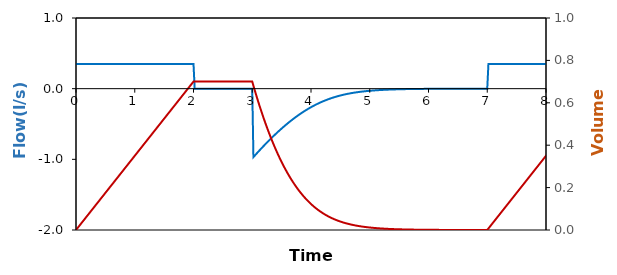
| Category | V' |
|---|---|
| 0.0 | 0.35 |
| 0.02 | 0.35 |
| 0.04 | 0.35 |
| 0.06 | 0.35 |
| 0.08 | 0.35 |
| 0.1 | 0.35 |
| 0.12 | 0.35 |
| 0.14 | 0.35 |
| 0.16 | 0.35 |
| 0.18 | 0.35 |
| 0.2 | 0.35 |
| 0.22 | 0.35 |
| 0.24 | 0.35 |
| 0.26 | 0.35 |
| 0.28 | 0.35 |
| 0.3 | 0.35 |
| 0.32 | 0.35 |
| 0.34 | 0.35 |
| 0.36 | 0.35 |
| 0.38 | 0.35 |
| 0.4 | 0.35 |
| 0.42 | 0.35 |
| 0.44 | 0.35 |
| 0.46 | 0.35 |
| 0.48 | 0.35 |
| 0.5 | 0.35 |
| 0.52 | 0.35 |
| 0.54 | 0.35 |
| 0.56 | 0.35 |
| 0.58 | 0.35 |
| 0.6 | 0.35 |
| 0.62 | 0.35 |
| 0.64 | 0.35 |
| 0.66 | 0.35 |
| 0.68 | 0.35 |
| 0.7 | 0.35 |
| 0.72 | 0.35 |
| 0.74 | 0.35 |
| 0.76 | 0.35 |
| 0.78 | 0.35 |
| 0.8 | 0.35 |
| 0.82 | 0.35 |
| 0.84 | 0.35 |
| 0.86 | 0.35 |
| 0.88 | 0.35 |
| 0.9 | 0.35 |
| 0.92 | 0.35 |
| 0.94 | 0.35 |
| 0.96 | 0.35 |
| 0.98 | 0.35 |
| 1.0 | 0.35 |
| 1.02 | 0.35 |
| 1.04 | 0.35 |
| 1.06 | 0.35 |
| 1.08 | 0.35 |
| 1.1 | 0.35 |
| 1.12 | 0.35 |
| 1.14 | 0.35 |
| 1.16 | 0.35 |
| 1.18 | 0.35 |
| 1.2 | 0.35 |
| 1.22 | 0.35 |
| 1.24 | 0.35 |
| 1.26 | 0.35 |
| 1.28 | 0.35 |
| 1.3 | 0.35 |
| 1.32 | 0.35 |
| 1.34 | 0.35 |
| 1.36 | 0.35 |
| 1.38 | 0.35 |
| 1.4 | 0.35 |
| 1.42 | 0.35 |
| 1.44 | 0.35 |
| 1.46 | 0.35 |
| 1.48 | 0.35 |
| 1.5 | 0.35 |
| 1.52 | 0.35 |
| 1.54 | 0.35 |
| 1.56 | 0.35 |
| 1.58 | 0.35 |
| 1.6 | 0.35 |
| 1.62 | 0.35 |
| 1.64 | 0.35 |
| 1.66 | 0.35 |
| 1.68 | 0.35 |
| 1.7 | 0.35 |
| 1.72 | 0.35 |
| 1.74 | 0.35 |
| 1.76 | 0.35 |
| 1.78 | 0.35 |
| 1.8 | 0.35 |
| 1.82 | 0.35 |
| 1.84 | 0.35 |
| 1.86 | 0.35 |
| 1.88 | 0.35 |
| 1.9 | 0.35 |
| 1.92 | 0.35 |
| 1.94 | 0.35 |
| 1.96 | 0.35 |
| 1.98 | 0.35 |
| 2.0 | 0.35 |
| 2.02 | 0 |
| 2.04 | 0 |
| 2.06 | 0 |
| 2.08 | 0 |
| 2.1 | 0 |
| 2.12 | 0 |
| 2.14 | 0 |
| 2.16 | 0 |
| 2.18 | 0 |
| 2.2 | 0 |
| 2.22 | 0 |
| 2.24 | 0 |
| 2.26 | 0 |
| 2.28 | 0 |
| 2.3 | 0 |
| 2.32 | 0 |
| 2.34 | 0 |
| 2.36 | 0 |
| 2.38 | 0 |
| 2.4 | 0 |
| 2.42 | 0 |
| 2.44 | 0 |
| 2.46 | 0 |
| 2.48 | 0 |
| 2.5 | 0 |
| 2.52 | 0 |
| 2.54 | 0 |
| 2.56 | 0 |
| 2.58 | 0 |
| 2.6 | 0 |
| 2.62 | 0 |
| 2.64 | 0 |
| 2.66 | 0 |
| 2.68 | 0 |
| 2.7 | 0 |
| 2.72 | 0 |
| 2.74 | 0 |
| 2.76 | 0 |
| 2.78 | 0 |
| 2.8 | 0 |
| 2.82 | 0 |
| 2.84 | 0 |
| 2.86 | 0 |
| 2.88 | 0 |
| 2.9 | 0 |
| 2.92 | 0 |
| 2.94 | 0 |
| 2.96 | 0 |
| 2.98 | 0 |
| 3.0 | 0 |
| 3.02 | -0.968 |
| 3.04 | -0.95 |
| 3.06 | -0.931 |
| 3.08 | -0.913 |
| 3.1 | -0.895 |
| 3.12 | -0.877 |
| 3.14 | -0.859 |
| 3.16 | -0.841 |
| 3.18 | -0.823 |
| 3.2 | -0.806 |
| 3.22 | -0.789 |
| 3.24 | -0.771 |
| 3.26 | -0.754 |
| 3.28 | -0.738 |
| 3.3 | -0.721 |
| 3.32 | -0.705 |
| 3.34 | -0.688 |
| 3.36 | -0.672 |
| 3.38 | -0.656 |
| 3.4 | -0.64 |
| 3.42 | -0.625 |
| 3.44 | -0.609 |
| 3.46 | -0.594 |
| 3.48 | -0.579 |
| 3.5 | -0.564 |
| 3.52 | -0.55 |
| 3.54 | -0.535 |
| 3.56 | -0.521 |
| 3.58 | -0.507 |
| 3.6 | -0.493 |
| 3.62 | -0.48 |
| 3.64 | -0.466 |
| 3.66 | -0.453 |
| 3.68 | -0.44 |
| 3.7 | -0.427 |
| 3.72 | -0.415 |
| 3.74 | -0.402 |
| 3.76 | -0.39 |
| 3.78 | -0.378 |
| 3.8 | -0.367 |
| 3.82 | -0.355 |
| 3.84 | -0.344 |
| 3.86 | -0.333 |
| 3.88 | -0.322 |
| 3.9 | -0.312 |
| 3.92 | -0.301 |
| 3.94 | -0.291 |
| 3.96 | -0.281 |
| 3.98 | -0.272 |
| 4.0 | -0.262 |
| 4.02 | -0.253 |
| 4.04 | -0.244 |
| 4.06 | -0.236 |
| 4.08 | -0.227 |
| 4.1 | -0.219 |
| 4.12 | -0.211 |
| 4.14 | -0.203 |
| 4.16 | -0.195 |
| 4.18 | -0.188 |
| 4.2 | -0.181 |
| 4.22 | -0.174 |
| 4.24 | -0.167 |
| 4.26 | -0.16 |
| 4.28 | -0.154 |
| 4.3 | -0.148 |
| 4.32 | -0.142 |
| 4.34 | -0.136 |
| 4.36 | -0.131 |
| 4.38 | -0.125 |
| 4.4 | -0.12 |
| 4.42 | -0.115 |
| 4.44 | -0.11 |
| 4.46 | -0.105 |
| 4.48 | -0.101 |
| 4.5 | -0.097 |
| 4.52 | -0.092 |
| 4.54 | -0.088 |
| 4.56 | -0.085 |
| 4.58 | -0.081 |
| 4.6 | -0.077 |
| 4.62 | -0.074 |
| 4.64 | -0.071 |
| 4.66 | -0.067 |
| 4.68 | -0.064 |
| 4.7 | -0.061 |
| 4.72 | -0.059 |
| 4.74 | -0.056 |
| 4.76 | -0.053 |
| 4.78 | -0.051 |
| 4.8 | -0.049 |
| 4.82 | -0.046 |
| 4.84 | -0.044 |
| 4.86 | -0.042 |
| 4.88 | -0.04 |
| 4.9 | -0.038 |
| 4.92 | -0.036 |
| 4.94 | -0.035 |
| 4.96 | -0.033 |
| 4.98 | -0.032 |
| 5.0 | -0.03 |
| 5.02 | -0.029 |
| 5.04 | -0.027 |
| 5.06 | -0.026 |
| 5.08 | -0.025 |
| 5.1 | -0.024 |
| 5.12 | -0.022 |
| 5.14 | -0.021 |
| 5.16 | -0.02 |
| 5.18 | -0.019 |
| 5.2 | -0.018 |
| 5.22 | -0.017 |
| 5.24 | -0.017 |
| 5.26 | -0.016 |
| 5.28 | -0.015 |
| 5.3 | -0.014 |
| 5.32 | -0.014 |
| 5.34 | -0.013 |
| 5.36 | -0.012 |
| 5.38 | -0.012 |
| 5.4 | -0.011 |
| 5.42 | -0.011 |
| 5.44 | -0.01 |
| 5.46 | -0.01 |
| 5.48 | -0.009 |
| 5.5 | -0.009 |
| 5.52 | -0.008 |
| 5.54 | -0.008 |
| 5.56 | -0.007 |
| 5.58 | -0.007 |
| 5.6 | -0.007 |
| 5.62 | -0.006 |
| 5.64 | -0.006 |
| 5.66 | -0.006 |
| 5.68 | -0.005 |
| 5.7 | -0.005 |
| 5.72 | -0.005 |
| 5.74 | -0.005 |
| 5.76 | -0.004 |
| 5.78 | -0.004 |
| 5.8 | -0.004 |
| 5.82 | -0.004 |
| 5.84 | -0.004 |
| 5.86 | -0.003 |
| 5.88 | -0.003 |
| 5.9 | -0.003 |
| 5.92 | -0.003 |
| 5.94 | -0.003 |
| 5.96 | -0.003 |
| 5.98 | -0.003 |
| 6.0 | -0.002 |
| 6.02 | -0.002 |
| 6.04 | -0.002 |
| 6.06 | -0.002 |
| 6.08 | -0.002 |
| 6.1 | -0.002 |
| 6.12 | -0.002 |
| 6.14 | -0.002 |
| 6.16 | -0.002 |
| 6.18 | -0.002 |
| 6.2 | -0.001 |
| 6.22 | -0.001 |
| 6.24 | -0.001 |
| 6.26 | -0.001 |
| 6.28 | -0.001 |
| 6.3 | -0.001 |
| 6.32 | -0.001 |
| 6.34 | -0.001 |
| 6.36 | -0.001 |
| 6.38 | -0.001 |
| 6.4 | -0.001 |
| 6.42 | -0.001 |
| 6.44 | -0.001 |
| 6.46 | -0.001 |
| 6.48 | -0.001 |
| 6.5 | -0.001 |
| 6.52 | -0.001 |
| 6.54 | -0.001 |
| 6.56 | -0.001 |
| 6.58 | -0.001 |
| 6.6 | -0.001 |
| 6.62 | 0 |
| 6.64 | 0 |
| 6.66 | 0 |
| 6.68 | 0 |
| 6.7 | 0 |
| 6.72 | 0 |
| 6.74 | 0 |
| 6.76 | 0 |
| 6.78 | 0 |
| 6.8 | 0 |
| 6.82 | 0 |
| 6.84 | 0 |
| 6.86 | 0 |
| 6.88 | 0 |
| 6.9 | 0 |
| 6.92 | 0 |
| 6.94 | 0 |
| 6.96 | 0 |
| 6.98 | 0 |
| 7.0 | 0 |
| 7.02 | 0.35 |
| 7.04 | 0.35 |
| 7.06 | 0.35 |
| 7.08 | 0.35 |
| 7.1 | 0.35 |
| 7.12 | 0.35 |
| 7.14 | 0.35 |
| 7.16000000000001 | 0.35 |
| 7.18 | 0.35 |
| 7.2 | 0.35 |
| 7.22 | 0.35 |
| 7.24000000000001 | 0.35 |
| 7.26 | 0.35 |
| 7.28 | 0.35 |
| 7.3 | 0.35 |
| 7.32000000000001 | 0.35 |
| 7.34 | 0.35 |
| 7.36 | 0.35 |
| 7.38 | 0.35 |
| 7.40000000000001 | 0.35 |
| 7.42 | 0.35 |
| 7.44 | 0.35 |
| 7.46 | 0.35 |
| 7.48000000000001 | 0.35 |
| 7.5 | 0.35 |
| 7.52 | 0.35 |
| 7.54 | 0.35 |
| 7.56000000000001 | 0.35 |
| 7.58 | 0.35 |
| 7.6 | 0.35 |
| 7.62000000000001 | 0.35 |
| 7.64000000000001 | 0.35 |
| 7.66000000000001 | 0.35 |
| 7.68 | 0.35 |
| 7.70000000000001 | 0.35 |
| 7.72000000000001 | 0.35 |
| 7.74000000000001 | 0.35 |
| 7.76 | 0.35 |
| 7.78000000000001 | 0.35 |
| 7.80000000000001 | 0.35 |
| 7.82000000000001 | 0.35 |
| 7.84 | 0.35 |
| 7.86000000000001 | 0.35 |
| 7.88000000000001 | 0.35 |
| 7.90000000000001 | 0.35 |
| 7.92 | 0.35 |
| 7.94000000000001 | 0.35 |
| 7.96000000000001 | 0.35 |
| 7.98000000000001 | 0.35 |
| 8.0 | 0.35 |
| 8.02000000000001 | 0.35 |
| 8.04000000000001 | 0.35 |
| 8.06000000000001 | 0.35 |
| 8.08 | 0.35 |
| 8.10000000000001 | 0.35 |
| 8.12000000000001 | 0.35 |
| 8.14000000000001 | 0.35 |
| 8.16000000000001 | 0.35 |
| 8.18000000000001 | 0.35 |
| 8.20000000000001 | 0.35 |
| 8.22000000000001 | 0.35 |
| 8.24000000000001 | 0.35 |
| 8.26000000000001 | 0.35 |
| 8.28000000000001 | 0.35 |
| 8.30000000000001 | 0.35 |
| 8.32000000000001 | 0.35 |
| 8.34000000000001 | 0.35 |
| 8.36000000000001 | 0.35 |
| 8.38000000000001 | 0.35 |
| 8.40000000000001 | 0.35 |
| 8.42000000000001 | 0.35 |
| 8.44000000000001 | 0.35 |
| 8.46000000000001 | 0.35 |
| 8.48000000000001 | 0.35 |
| 8.50000000000001 | 0.35 |
| 8.52000000000001 | 0.35 |
| 8.54000000000001 | 0.35 |
| 8.56000000000001 | 0.35 |
| 8.58000000000001 | 0.35 |
| 8.60000000000001 | 0.35 |
| 8.62000000000001 | 0.35 |
| 8.64000000000001 | 0.35 |
| 8.66000000000001 | 0.35 |
| 8.68000000000001 | 0.35 |
| 8.70000000000001 | 0.35 |
| 8.72000000000001 | 0.35 |
| 8.74000000000001 | 0.35 |
| 8.76000000000001 | 0.35 |
| 8.78000000000001 | 0.35 |
| 8.80000000000001 | 0.35 |
| 8.82000000000001 | 0.35 |
| 8.84000000000001 | 0.35 |
| 8.86000000000001 | 0.35 |
| 8.88000000000001 | 0.35 |
| 8.90000000000001 | 0.35 |
| 8.92000000000001 | 0.35 |
| 8.94000000000001 | 0.35 |
| 8.96000000000001 | 0.35 |
| 8.98000000000001 | 0.35 |
| 9.00000000000001 | 0.35 |